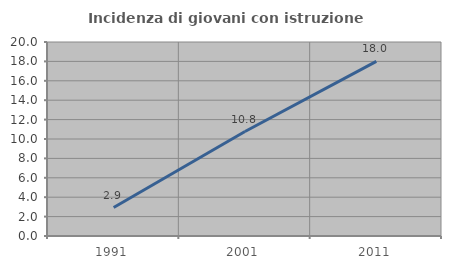
| Category | Incidenza di giovani con istruzione universitaria |
|---|---|
| 1991.0 | 2.935 |
| 2001.0 | 10.769 |
| 2011.0 | 17.996 |